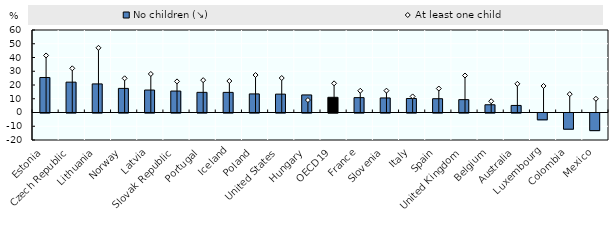
| Category | No children (↘) |
|---|---|
| Estonia | 25.466 |
| Czech Republic | 22.068 |
| Lithuania | 20.794 |
| Norway | 17.526 |
| Latvia | 16.331 |
| Slovak Republic | 15.6 |
| Portugal | 14.649 |
| Iceland | 14.628 |
| Poland | 13.513 |
| United States | 13.353 |
| Hungary | 12.783 |
| OECD19 | 11.046 |
| France | 10.809 |
| Slovenia | 10.582 |
| Italy | 10.19 |
| Spain | 10.032 |
| United Kingdom | 9.357 |
| Belgium | 5.635 |
| Australia | 5.129 |
| Luxembourg | -4.961 |
| Colombia | -11.778 |
| Mexico | -12.827 |